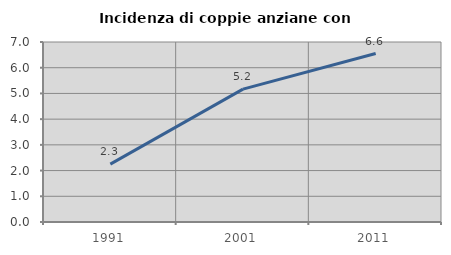
| Category | Incidenza di coppie anziane con figli |
|---|---|
| 1991.0 | 2.251 |
| 2001.0 | 5.167 |
| 2011.0 | 6.553 |